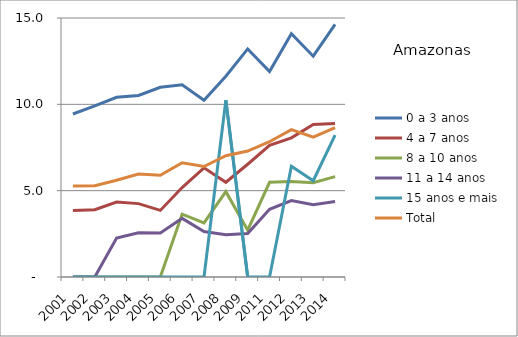
| Category | 0 a 3 anos | 4 a 7 anos | 8 a 10 anos | 11 a 14 anos | 15 anos e mais | Total |
|---|---|---|---|---|---|---|
| 2001.0 | 9.442 | 3.856 | 0 | 0 | 0 | 5.267 |
| 2002.0 | 9.907 | 3.893 | 0 | 0 | 0 | 5.282 |
| 2003.0 | 10.407 | 4.343 | 0 | 2.261 | 0 | 5.606 |
| 2004.0 | 10.513 | 4.25 | 0 | 2.561 | 0 | 5.959 |
| 2005.0 | 10.988 | 3.856 | 0 | 2.549 | 0 | 5.89 |
| 2006.0 | 11.134 | 5.182 | 3.641 | 3.396 | 0 | 6.613 |
| 2007.0 | 10.242 | 6.326 | 3.131 | 2.634 | 0 | 6.401 |
| 2008.0 | 11.628 | 5.486 | 4.943 | 2.452 | 10.244 | 7.023 |
| 2009.0 | 13.21 | 6.531 | 2.712 | 2.513 | 0 | 7.295 |
| 2011.0 | 11.898 | 7.623 | 5.482 | 3.923 | 0 | 7.833 |
| 2012.0 | 14.091 | 8.056 | 5.527 | 4.426 | 6.419 | 8.537 |
| 2013.0 | 12.788 | 8.837 | 5.457 | 4.185 | 5.578 | 8.101 |
| 2014.0 | 14.636 | 8.894 | 5.813 | 4.376 | 8.221 | 8.651 |